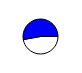
| Category | Series 0 |
|---|---|
| 0 | 31885 |
| 1 | 35750 |